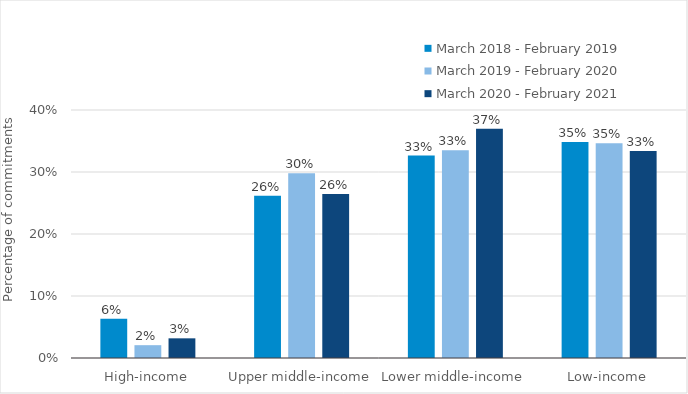
| Category | March 2018 - February 2019 | March 2019 - February 2020 | March 2020 - February 2021 |
|---|---|---|---|
| High-income | 0.063 | 0.021 | 0.032 |
| Upper middle-income | 0.262 | 0.298 | 0.264 |
| Lower middle-income | 0.327 | 0.335 | 0.37 |
| Low-income | 0.349 | 0.346 | 0.334 |